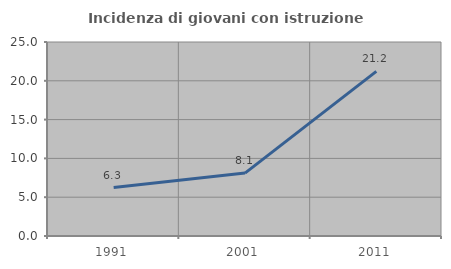
| Category | Incidenza di giovani con istruzione universitaria |
|---|---|
| 1991.0 | 6.25 |
| 2001.0 | 8.108 |
| 2011.0 | 21.212 |